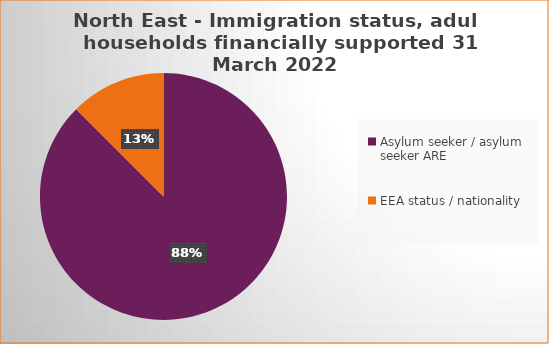
| Category | Number  | Percentage |
|---|---|---|
| Asylum seeker / asylum seeker ARE | 7 | 0.87 |
| EEA status / nationality  | 1 | 0.13 |